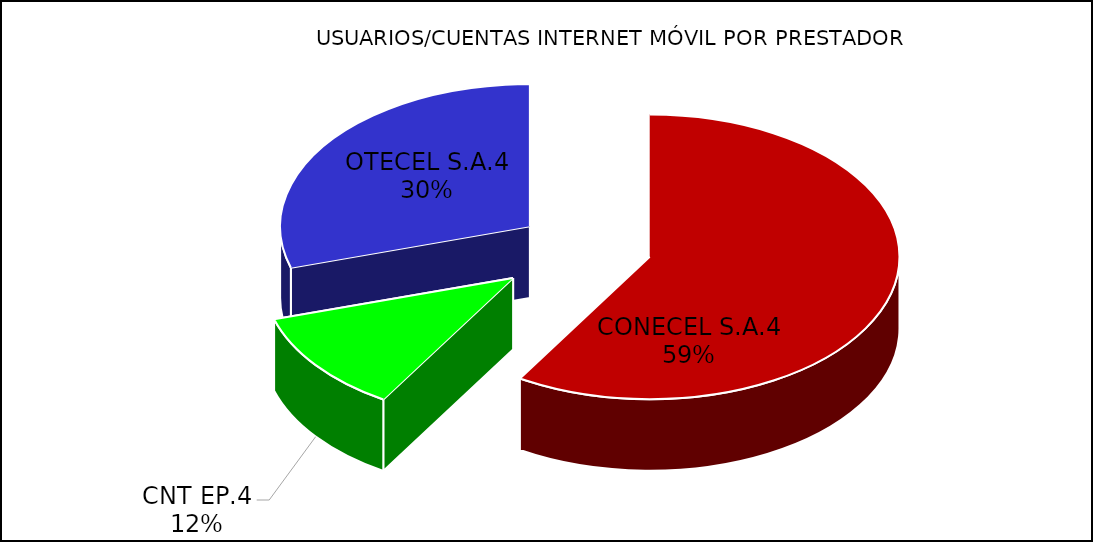
| Category | Series 0 |
|---|---|
| CONECEL S.A.4 | 0.587 |
| CNT EP.4 | 0.116 |
| OTECEL S.A.4 | 0.297 |